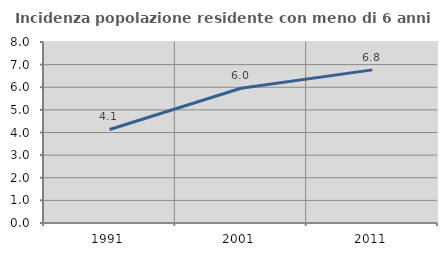
| Category | Incidenza popolazione residente con meno di 6 anni |
|---|---|
| 1991.0 | 4.134 |
| 2001.0 | 5.956 |
| 2011.0 | 6.768 |